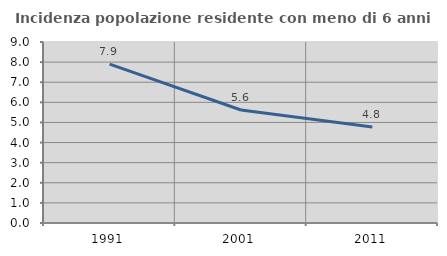
| Category | Incidenza popolazione residente con meno di 6 anni |
|---|---|
| 1991.0 | 7.898 |
| 2001.0 | 5.617 |
| 2011.0 | 4.776 |